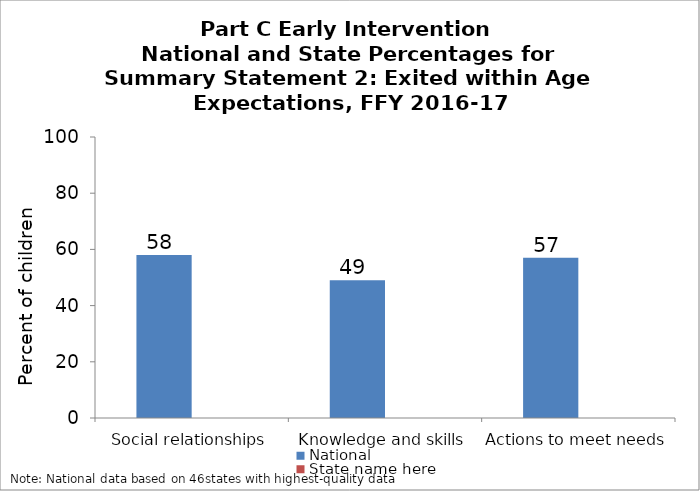
| Category | National | State name here |
|---|---|---|
| Social relationships | 58 |  |
| Knowledge and skills | 49 |  |
| Actions to meet needs | 57 |  |